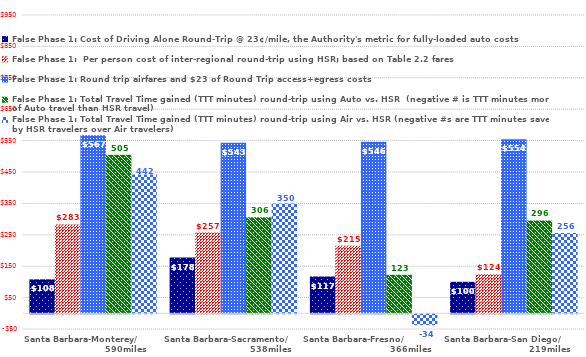
| Category | False Phase 1: Cost of Driving Alone Round-Trip @ 23¢/mile, the Authority's metric for fully-loaded auto costs | False Phase 1:  Per person cost of inter-regional round-trip using HSR; based on Table 2.2 fares | False Phase 1: Round trip airfares and $23 of Round Trip access+egress costs | False Phase 1: Total Travel Time gained (TTT minutes) round-trip using Auto vs. HSR  (negative # is TTT minutes more of Auto travel than HSR travel) | False Phase 1: Total Travel Time gained (TTT minutes) round-trip using Air vs. HSR (negative #s are TTT minutes saved by HSR travelers over Air travelers) |
|---|---|---|---|---|---|
| Santa Barbara-Monterey/                              590miles | 108.1 | 283 | 567 | 504.9 | 442 |
| Santa Barbara-Sacramento/                             538miles | 177.56 | 257 | 543 | 305.7 | 350 |
| Santa Barbara-Fresno/                                      366miles | 116.84 | 215 | 546 | 122.7 | -34 |
| Santa Barbara-San Diego/                               219miles | 100.28 | 124 | 554 | 295.7 | 256 |